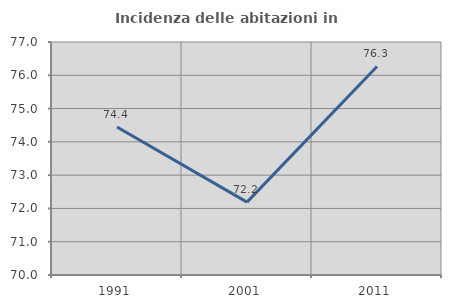
| Category | Incidenza delle abitazioni in proprietà  |
|---|---|
| 1991.0 | 74.448 |
| 2001.0 | 72.189 |
| 2011.0 | 76.265 |